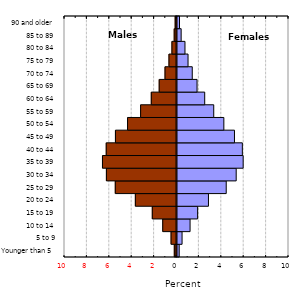
| Category | Series 0 |
|---|---|
| Younger than 5 | 0.197 |
| 5 to 9 | 0.452 |
| 10 to 14 | 1.167 |
| 15 to 19 | 1.841 |
| 20 to 24 | 2.809 |
| 25 to 29 | 4.395 |
| 30 to 34 | 5.285 |
| 35 to 39 | 5.907 |
| 40 to 44 | 5.835 |
| 45 to 49 | 5.132 |
| 50 to 54 | 4.184 |
| 55 to 59 | 3.281 |
| 60 to 64 | 2.475 |
| 65 to 69 | 1.791 |
| 70 to 74 | 1.363 |
| 75 to 79 | 0.986 |
| 80 to 84 | 0.712 |
| 85 to 89 | 0.37 |
| 90 and older | 0.224 |